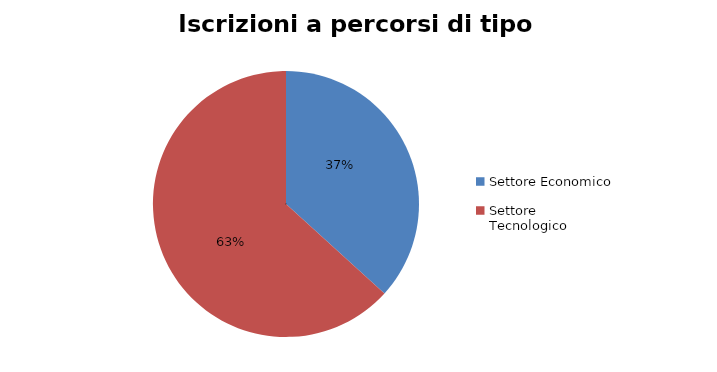
| Category | Series 0 |
|---|---|
| Settore Economico | 5039 |
| Settore Tecnologico | 8678 |